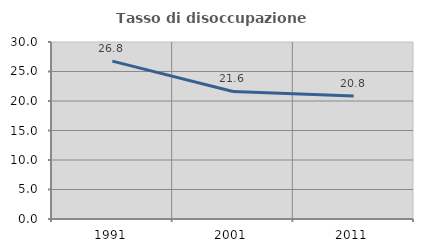
| Category | Tasso di disoccupazione giovanile  |
|---|---|
| 1991.0 | 26.752 |
| 2001.0 | 21.622 |
| 2011.0 | 20.833 |